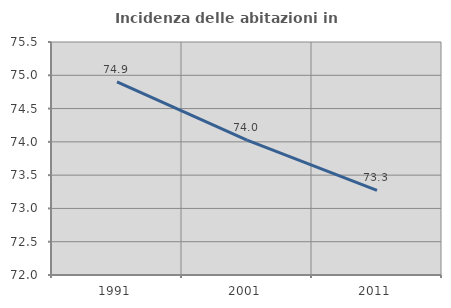
| Category | Incidenza delle abitazioni in proprietà  |
|---|---|
| 1991.0 | 74.9 |
| 2001.0 | 74.025 |
| 2011.0 | 73.271 |